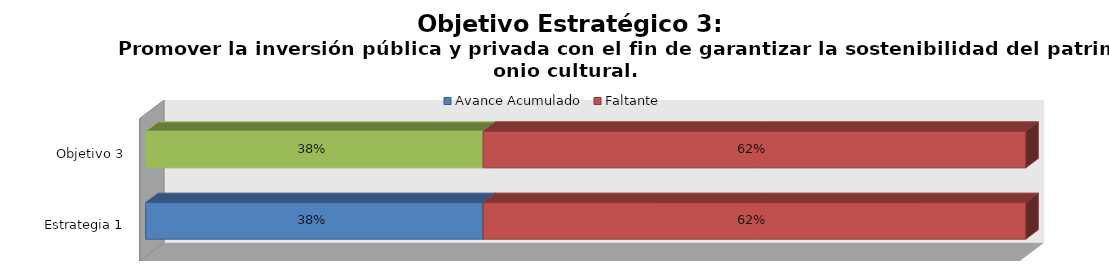
| Category | Avance Acumulado | Faltante |
|---|---|---|
| Estrategia 1 | 0.383 | 0.617 |
| Objetivo 3 | 0.383 | 0.617 |